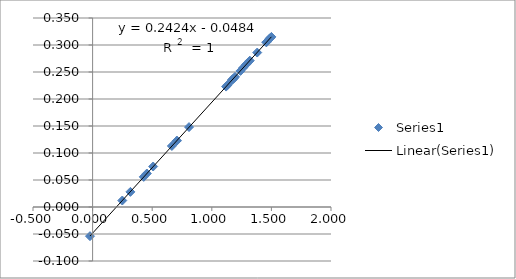
| Category | Series 0 |
|---|---|
| -0.02200000000000024 | -0.054 |
| 0.24899999999999967 | 0.012 |
| 0.31700000000000017 | 0.028 |
| 0.45500000000000007 | 0.062 |
| 0.4289999999999994 | 0.056 |
| 0.508 | 0.075 |
| 0.7029999999999994 | 0.122 |
| 0.665 | 0.113 |
| 0.7080000000000002 | 0.123 |
| 0.8090000000000002 | 0.148 |
| 1.133 | 0.226 |
| 1.1689999999999996 | 0.235 |
| 1.1829999999999998 | 0.238 |
| 1.173 | 0.236 |
| 1.12 | 0.223 |
| 1.1950000000000003 | 0.241 |
| 1.2409999999999997 | 0.252 |
| 1.2640000000000002 | 0.258 |
| 1.2880000000000003 | 0.264 |
| 1.319 | 0.271 |
| 1.3810000000000002 | 0.286 |
| 1.4619999999999997 | 0.306 |
| 1.5 | 0.315 |
| 1.4910000000000005 | 0.313 |
| 1.4859999999999998 | 0.312 |
| 1.4570000000000007 | 0.305 |